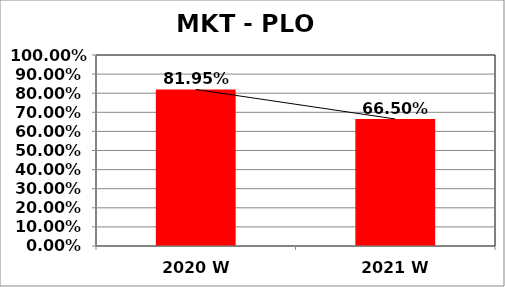
| Category | Series 0 |
|---|---|
| 2020 W | 0.82 |
| 2021 W | 0.665 |